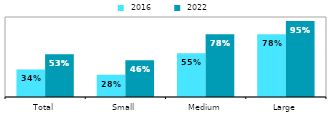
| Category |  2016 |  2022 |
|---|---|---|
| Total | 0.344 | 0.534 |
| Small | 0.279 | 0.46 |
| Medium | 0.547 | 0.783 |
| Large | 0.783 | 0.948 |